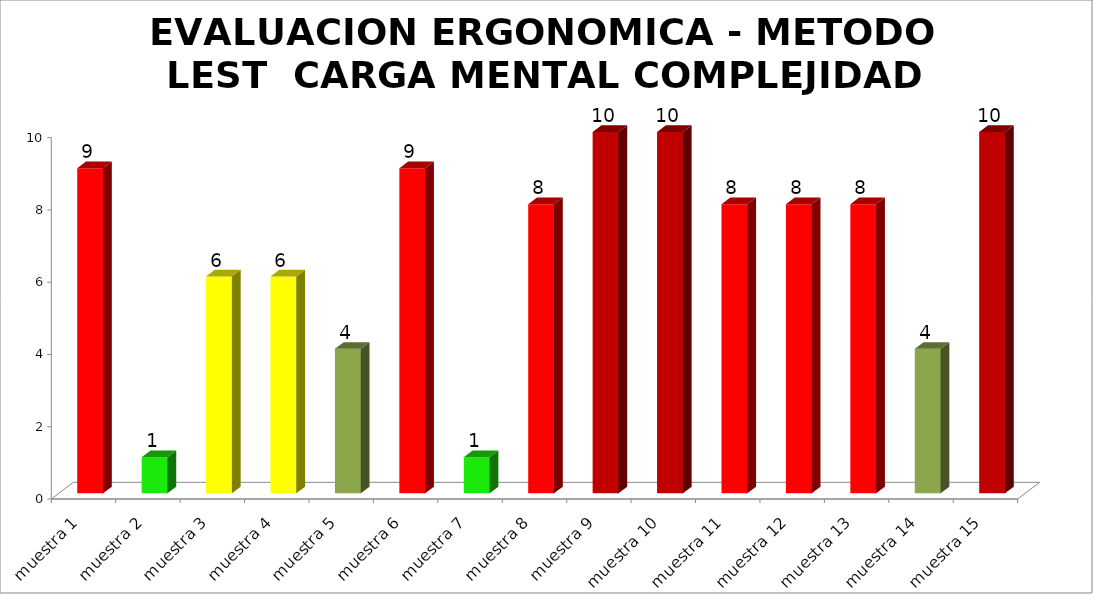
| Category | EVALUACION ERGONOMICA - METODO LEST  |
|---|---|
| muestra 1 | 9 |
| muestra 2 | 1 |
| muestra 3 | 6 |
| muestra 4 | 6 |
| muestra 5 | 4 |
| muestra 6 | 9 |
| muestra 7 | 1 |
| muestra 8 | 8 |
| muestra 9 | 10 |
| muestra 10 | 10 |
| muestra 11 | 8 |
| muestra 12 | 8 |
| muestra 13 | 8 |
| muestra 14 | 4 |
| muestra 15 | 10 |